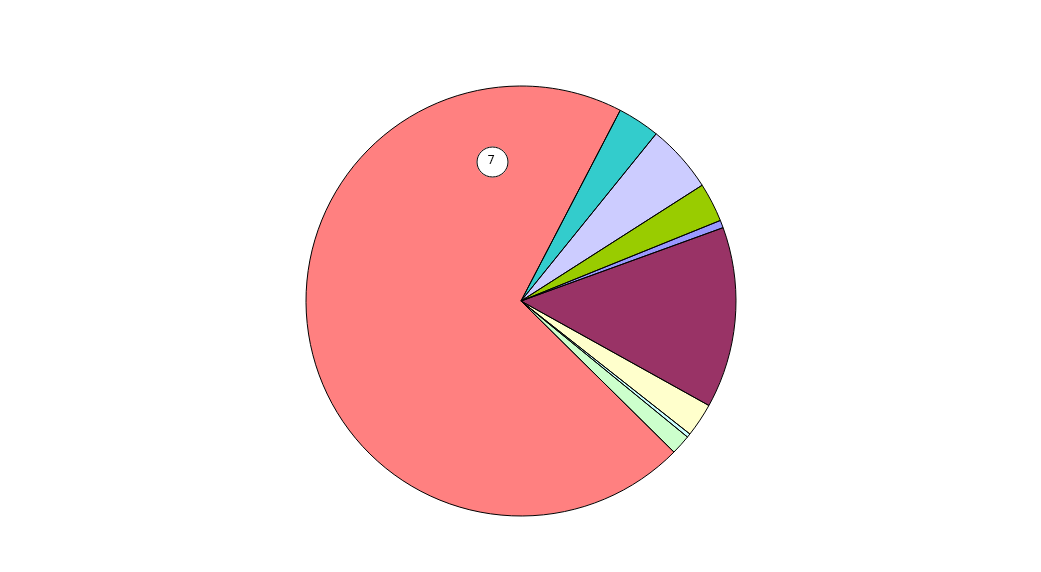
| Category | Series 0 | Series 1 | Series 2 | Series 3 | Series 4 | Series 5 | Series 6 | Series 7 | Series 8 |
|---|---|---|---|---|---|---|---|---|---|
| 0 | 0.006 |  |  |  |  |  |  |  |  |
| 1 | 0.136 |  |  |  |  |  |  |  |  |
| 2 | 0.025 |  |  |  |  |  |  |  |  |
| 3 | 0.003 |  |  |  |  |  |  |  |  |
| 4 | 0.015 |  |  |  |  |  |  |  |  |
| 5 | 0.702 |  |  |  |  |  |  |  |  |
| 6 | 0.032 |  |  |  |  |  |  |  |  |
| 7 | 0.051 |  |  |  |  |  |  |  |  |
| 8 | 0.029 |  |  |  |  |  |  |  |  |